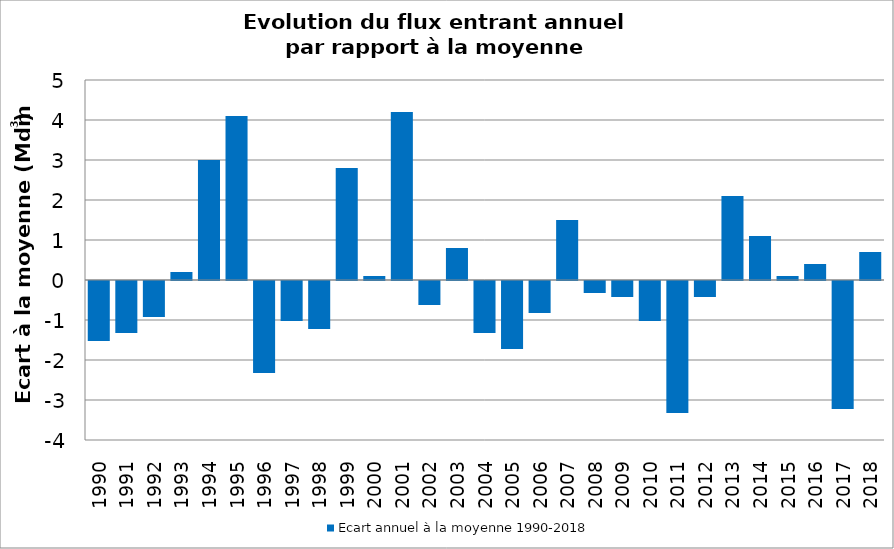
| Category | Ecart annuel à la moyenne 1990-2018 |
|---|---|
| 1990.0 | -1.5 |
| 1991.0 | -1.3 |
| 1992.0 | -0.9 |
| 1993.0 | 0.2 |
| 1994.0 | 3 |
| 1995.0 | 4.1 |
| 1996.0 | -2.3 |
| 1997.0 | -1 |
| 1998.0 | -1.2 |
| 1999.0 | 2.8 |
| 2000.0 | 0.1 |
| 2001.0 | 4.2 |
| 2002.0 | -0.6 |
| 2003.0 | 0.8 |
| 2004.0 | -1.3 |
| 2005.0 | -1.7 |
| 2006.0 | -0.8 |
| 2007.0 | 1.5 |
| 2008.0 | -0.3 |
| 2009.0 | -0.4 |
| 2010.0 | -1 |
| 2011.0 | -3.3 |
| 2012.0 | -0.4 |
| 2013.0 | 2.1 |
| 2014.0 | 1.1 |
| 2015.0 | 0.1 |
| 2016.0 | 0.4 |
| 2017.0 | -3.2 |
| 2018.0 | 0.7 |